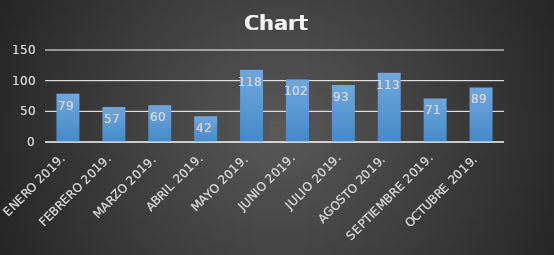
| Category | Series 0 |
|---|---|
| ENERO 2019. | 79 |
| FEBRERO 2019. | 57 |
| MARZO 2019. | 60 |
| ABRIL 2019. | 42 |
| MAYO 2019. | 118 |
| JUNIO 2019. | 102 |
| JULIO 2019. | 93 |
| AGOSTO 2019. | 113 |
| SEPTIEMBRE 2019. | 71 |
| OCTUBRE 2019. | 89 |